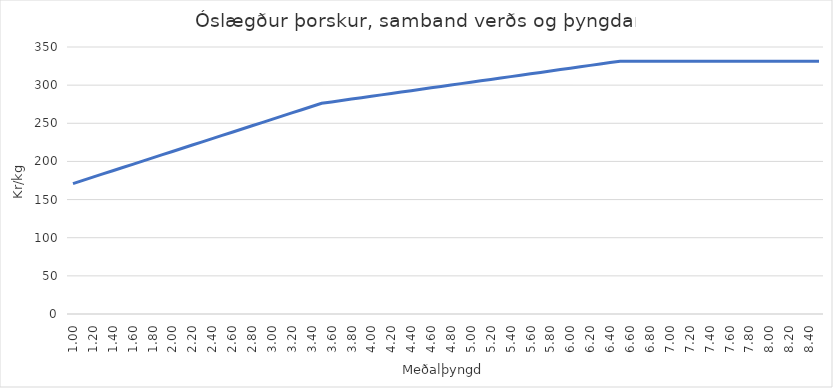
| Category | Series 0 |
|---|---|
| 1.0 | 170.976 |
| 1.1 | 175.185 |
| 1.2 | 179.394 |
| 1.3 | 183.602 |
| 1.4 | 187.811 |
| 1.5 | 192.02 |
| 1.6 | 196.228 |
| 1.7 | 200.437 |
| 1.8 | 204.646 |
| 1.9 | 208.854 |
| 2.0 | 213.063 |
| 2.1 | 217.272 |
| 2.2 | 221.48 |
| 2.3 | 225.689 |
| 2.4 | 229.897 |
| 2.5 | 234.106 |
| 2.6 | 238.315 |
| 2.7 | 242.523 |
| 2.8 | 246.732 |
| 2.9 | 250.941 |
| 3.0 | 255.149 |
| 3.1 | 259.358 |
| 3.2 | 263.567 |
| 3.3 | 267.775 |
| 3.4 | 271.984 |
| 3.5 | 276.193 |
| 3.6 | 278.034 |
| 3.7 | 279.875 |
| 3.8 | 281.716 |
| 3.9 | 283.558 |
| 4.0 | 285.399 |
| 4.1 | 287.24 |
| 4.2 | 289.082 |
| 4.3 | 290.923 |
| 4.4 | 292.764 |
| 4.5 | 294.605 |
| 4.6 | 296.447 |
| 4.7 | 298.288 |
| 4.8 | 300.129 |
| 4.9 | 301.971 |
| 5.0 | 303.812 |
| 5.1 | 305.653 |
| 5.2 | 307.494 |
| 5.3 | 309.336 |
| 5.4 | 311.177 |
| 5.5 | 313.018 |
| 5.6 | 314.86 |
| 5.7 | 316.701 |
| 5.8 | 318.542 |
| 5.9 | 320.383 |
| 6.0 | 322.225 |
| 6.1 | 324.066 |
| 6.2 | 325.907 |
| 6.3 | 327.749 |
| 6.4 | 329.59 |
| 6.50000000000001 | 331.431 |
| 6.6 | 331.431 |
| 6.7 | 331.431 |
| 6.80000000000001 | 331.431 |
| 6.90000000000001 | 331.431 |
| 7.00000000000001 | 331.431 |
| 7.100000000000009 | 331.431 |
| 7.200000000000009 | 331.431 |
| 7.300000000000009 | 331.431 |
| 7.400000000000008 | 331.431 |
| 7.500000000000008 | 331.431 |
| 7.600000000000008 | 331.431 |
| 7.700000000000007 | 331.431 |
| 7.800000000000007 | 331.431 |
| 7.900000000000007 | 331.431 |
| 8.000000000000007 | 331.431 |
| 8.100000000000007 | 331.431 |
| 8.200000000000006 | 331.431 |
| 8.300000000000006 | 331.431 |
| 8.400000000000006 | 331.431 |
| 8.500000000000005 | 331.431 |